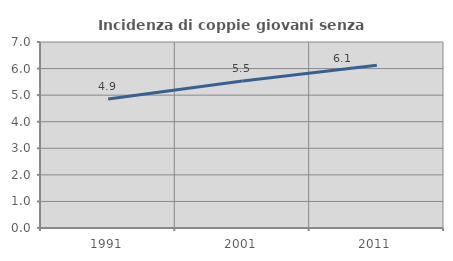
| Category | Incidenza di coppie giovani senza figli |
|---|---|
| 1991.0 | 4.854 |
| 2001.0 | 5.535 |
| 2011.0 | 6.127 |